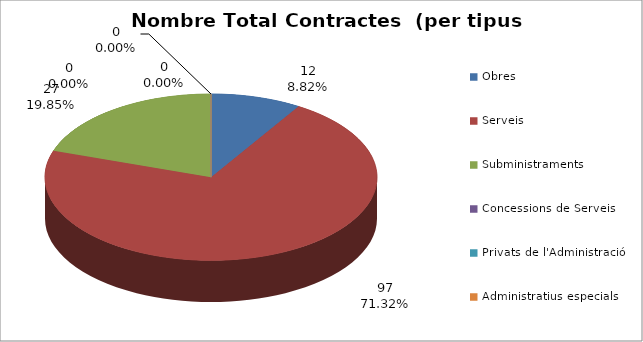
| Category | Nombre Total Contractes |
|---|---|
| Obres | 12 |
| Serveis | 97 |
| Subministraments | 27 |
| Concessions de Serveis | 0 |
| Privats de l'Administració | 0 |
| Administratius especials | 0 |